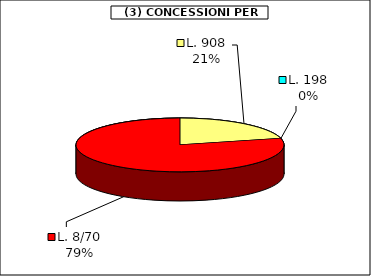
| Category | Series 0 |
|---|---|
| L. 908 | 38556.625 |
| L. 198 | 0 |
| L. 8/70 | 144182.5 |